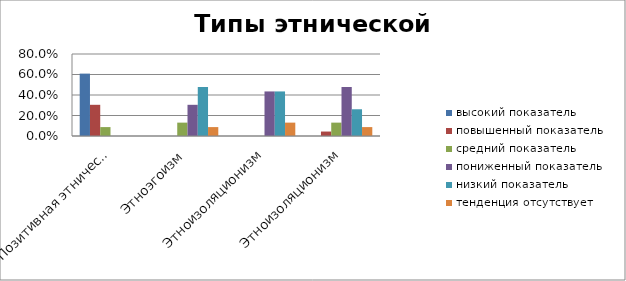
| Category | высокий показатель | повышенный показатель | средний показатель | пониженный показатель | низкий показатель | тенденция отсутствует |
|---|---|---|---|---|---|---|
| Позитивная этническая идентичность | 0.609 | 0.304 | 0.087 | 0 | 0 | 0 |
| Этноэгоизм | 0 | 0 | 0.13 | 0.304 | 0.478 | 0.087 |
| Этноизоляционизм | 0 | 0 | 0 | 0.435 | 0.435 | 0.13 |
| Этноизоляционизм | 0 | 0.043 | 0.13 | 0.478 | 0.261 | 0.087 |